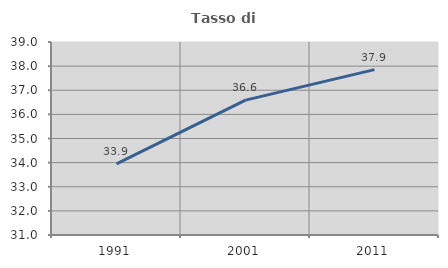
| Category | Tasso di occupazione   |
|---|---|
| 1991.0 | 33.946 |
| 2001.0 | 36.591 |
| 2011.0 | 37.856 |